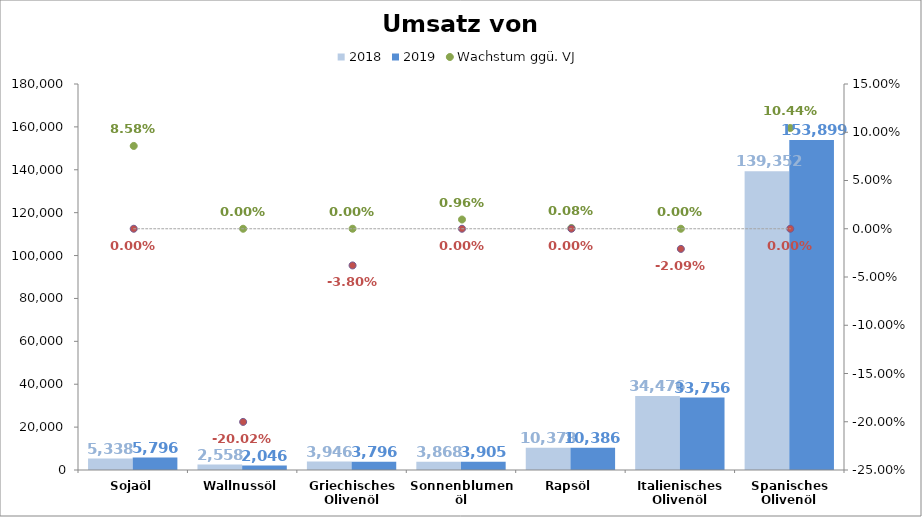
| Category | 2018 | 2019 |
|---|---|---|
| Sojaöl | 5338 | 5796 |
| Wallnussöl | 2558 | 2046 |
| Griechisches Olivenöl | 3946 | 3796 |
| Sonnenblumenöl | 3868 | 3905 |
| Rapsöl | 10378 | 10386 |
| Italienisches Olivenöl | 34476 | 33756 |
| Spanisches Olivenöl | 139352 | 153899 |